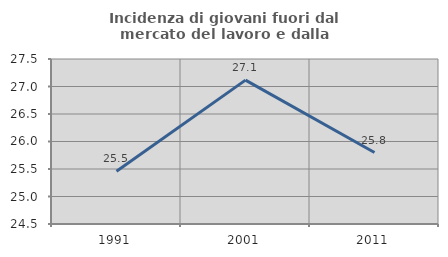
| Category | Incidenza di giovani fuori dal mercato del lavoro e dalla formazione  |
|---|---|
| 1991.0 | 25.46 |
| 2001.0 | 27.116 |
| 2011.0 | 25.799 |